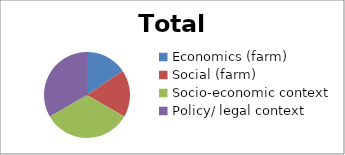
| Category | Total | Citizens |
|---|---|---|
| Economics (farm) | 23 | 12 |
| Social (farm) | 40 | 19 |
| Socio-economic context | 31 | 17 |
| Policy/ legal context | 52 | 42 |